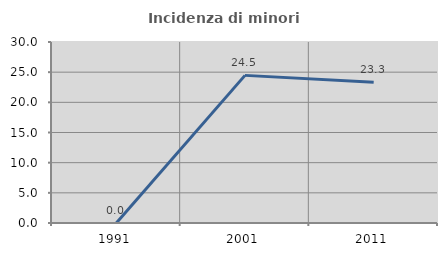
| Category | Incidenza di minori stranieri |
|---|---|
| 1991.0 | 0 |
| 2001.0 | 24.468 |
| 2011.0 | 23.333 |